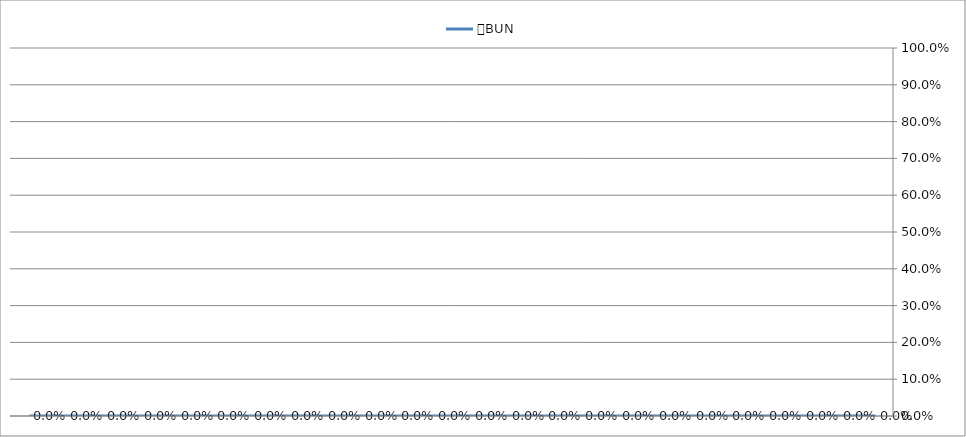
| Category | ％BUN |
|---|---|
|  | 0 |
|  | 0 |
|  | 0 |
|  | 0 |
|  | 0 |
|  | 0 |
|  | 0 |
|  | 0 |
|  | 0 |
|  | 0 |
|  | 0 |
|  | 0 |
|  | 0 |
|  | 0 |
|  | 0 |
|  | 0 |
|  | 0 |
|  | 0 |
|  | 0 |
|  | 0 |
|  | 0 |
|  | 0 |
|  | 0 |
|  | 0 |